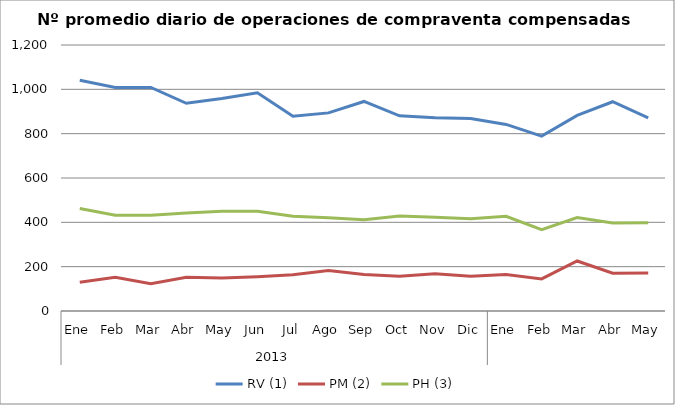
| Category | RV (1) | PM (2) | PH (3) |
|---|---|---|---|
| 0 | 1040.636 | 129.682 | 462.545 |
| 1 | 1008.7 | 152.35 | 432.05 |
| 2 | 1008.45 | 123.6 | 431.9 |
| 3 | 937.091 | 152.273 | 442.545 |
| 4 | 958.381 | 148.429 | 449.571 |
| 5 | 984.3 | 154.95 | 450 |
| 6 | 878.955 | 163.091 | 427.955 |
| 7 | 893.762 | 182.333 | 420.857 |
| 8 | 945.278 | 164.944 | 411.222 |
| 9 | 880.5 | 156.955 | 428.864 |
| 10 | 871.35 | 167.95 | 423.25 |
| 11 | 868.85 | 156.75 | 415.75 |
| 12 | 841.591 | 164.955 | 427.091 |
| 13 | 788.8 | 144.95 | 366.85 |
| 14 | 882.238 | 225.667 | 421.238 |
| 15 | 944 | 170.238 | 397.381 |
| 16 | 871.55 | 171.45 | 398.25 |